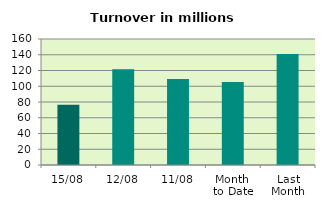
| Category | Series 0 |
|---|---|
| 15/08 | 76.438 |
| 12/08 | 121.717 |
| 11/08 | 109.202 |
| Month 
to Date | 105.363 |
| Last
Month | 140.832 |